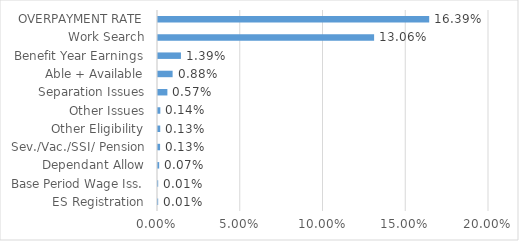
| Category | Series 0 |
|---|---|
| ES Registration | 0 |
| Base Period Wage Iss. | 0 |
| Dependant Allow | 0.001 |
| Sev./Vac./SSI/ Pension | 0.001 |
| Other Eligibility | 0.001 |
| Other Issues | 0.001 |
| Separation Issues | 0.006 |
| Able + Available | 0.009 |
| Benefit Year Earnings | 0.014 |
| Work Search | 0.131 |
| OVERPAYMENT RATE | 0.164 |